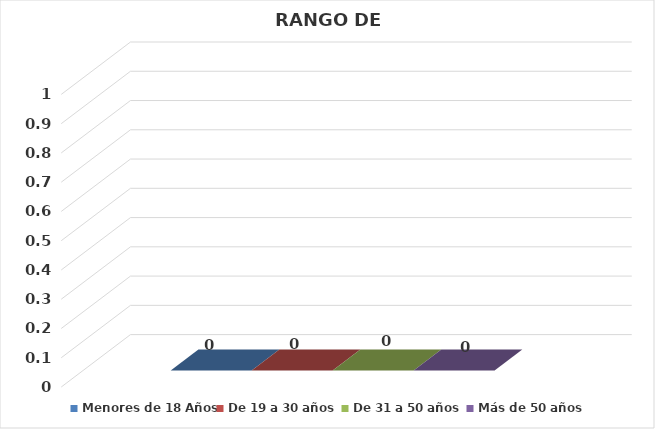
| Category | Menores de 18 Años | De 19 a 30 años  | De 31 a 50 años  | Más de 50 años  |
|---|---|---|---|---|
| 0 | 0 | 0 | 0 | 0 |